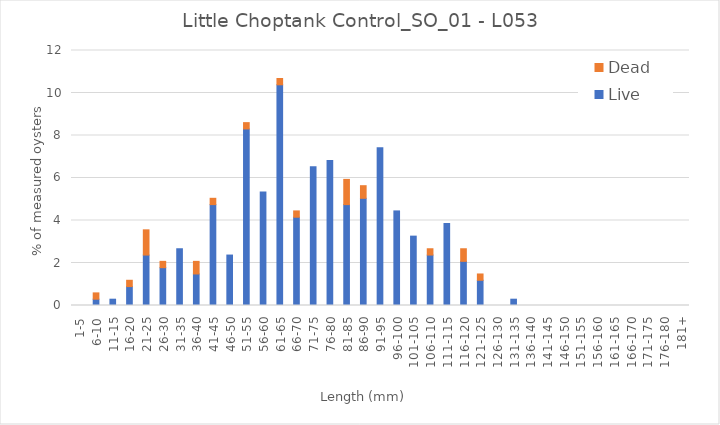
| Category | Live | Dead |
|---|---|---|
| 1-5 | 0 | 0 |
| 6-10 | 0.297 | 0.297 |
| 11-15 | 0.297 | 0 |
| 16-20 | 0.89 | 0.297 |
| 21-25 | 2.374 | 1.187 |
| 26-30 | 1.78 | 0.297 |
| 31-35 | 2.671 | 0 |
| 36-40 | 1.484 | 0.593 |
| 41-45 | 4.748 | 0.297 |
| 46-50 | 2.374 | 0 |
| 51-55 | 8.309 | 0.297 |
| 56-60 | 5.341 | 0 |
| 61-65 | 10.386 | 0.297 |
| 66-70 | 4.154 | 0.297 |
| 71-75 | 6.528 | 0 |
| 76-80 | 6.825 | 0 |
| 81-85 | 4.748 | 1.187 |
| 86-90 | 5.045 | 0.593 |
| 91-95 | 7.418 | 0 |
| 96-100 | 4.451 | 0 |
| 101-105 | 3.264 | 0 |
| 106-110 | 2.374 | 0.297 |
| 111-115 | 3.858 | 0 |
| 116-120 | 2.077 | 0.593 |
| 121-125 | 1.187 | 0.297 |
| 126-130 | 0 | 0 |
| 131-135 | 0.297 | 0 |
| 136-140 | 0 | 0 |
| 141-145 | 0 | 0 |
| 146-150 | 0 | 0 |
| 151-155 | 0 | 0 |
| 156-160 | 0 | 0 |
| 161-165 | 0 | 0 |
| 166-170 | 0 | 0 |
| 171-175 | 0 | 0 |
| 176-180 | 0 | 0 |
| 181+ | 0 | 0 |